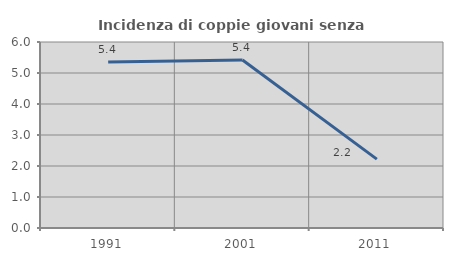
| Category | Incidenza di coppie giovani senza figli |
|---|---|
| 1991.0 | 5.357 |
| 2001.0 | 5.419 |
| 2011.0 | 2.222 |